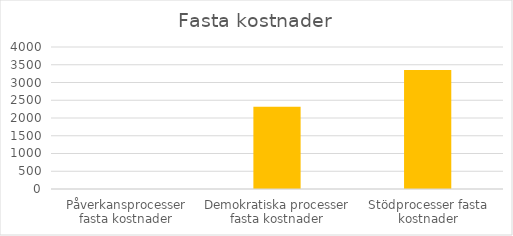
| Category | Series 3 |
|---|---|
| Påverkansprocesser fasta kostnader | 0 |
| Demokratiska processer fasta kostnader | 2315 |
| Stödprocesser fasta kostnader | 3350 |